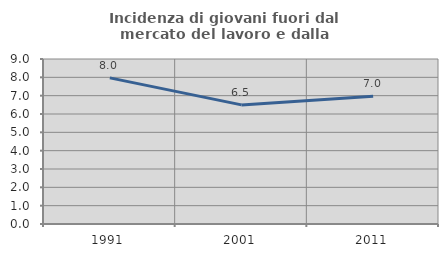
| Category | Incidenza di giovani fuori dal mercato del lavoro e dalla formazione  |
|---|---|
| 1991.0 | 7.97 |
| 2001.0 | 6.496 |
| 2011.0 | 6.971 |